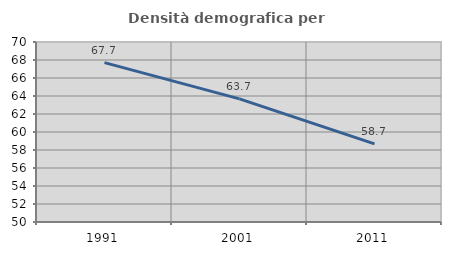
| Category | Densità demografica |
|---|---|
| 1991.0 | 67.71 |
| 2001.0 | 63.676 |
| 2011.0 | 58.675 |